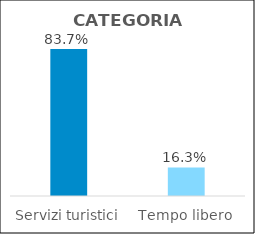
| Category | Series 0 |
|---|---|
| Servizi turistici | 0.837 |
| Tempo libero | 0.163 |